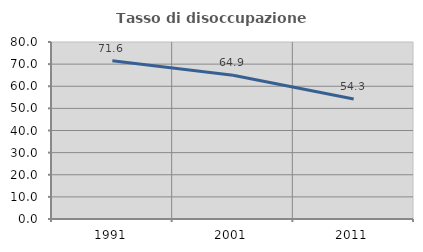
| Category | Tasso di disoccupazione giovanile  |
|---|---|
| 1991.0 | 71.554 |
| 2001.0 | 64.931 |
| 2011.0 | 54.27 |